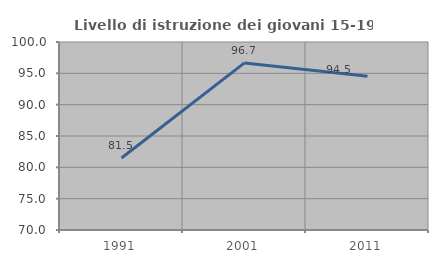
| Category | Livello di istruzione dei giovani 15-19 anni |
|---|---|
| 1991.0 | 81.481 |
| 2001.0 | 96.667 |
| 2011.0 | 94.545 |